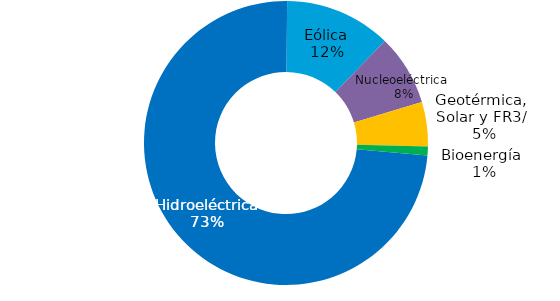
| Category | Series 0 |
|---|---|
| Hidroeléctrica | 0.73 |
| Eólica | 0.12 |
| Nucleoeléctrica | 0.08 |
| Geotérmica, Solar y FR3/ | 0.05 |
| Bioenergía | 0.01 |